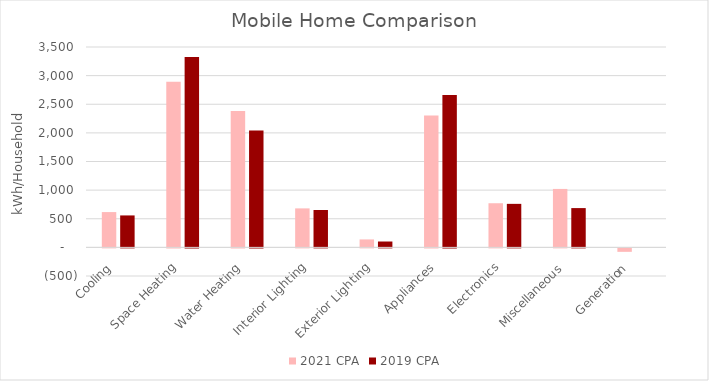
| Category | 2021 CPA | 2019 CPA |
|---|---|---|
|  Cooling  | 616.605 | 558.029 |
|  Space Heating  | 2891.074 | 3327.448 |
|  Water Heating  | 2381.951 | 2040.555 |
|  Interior Lighting  | 680.993 | 652.693 |
|  Exterior Lighting  | 138.838 | 102.485 |
|  Appliances  | 2302.136 | 2661.81 |
|  Electronics  | 770.883 | 760.147 |
|  Miscellaneous  | 1020.784 | 686.263 |
|  Generation  | -60.64 | 0 |